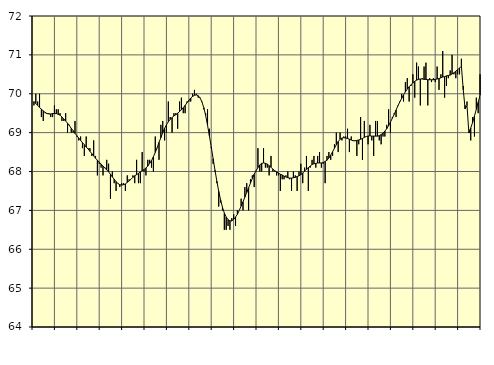
| Category | Piggar | Series 1 |
|---|---|---|
| nan | 69.7 | 69.8 |
| 1.0 | 70 | 69.75 |
| 1.0 | 69.8 | 69.7 |
| 1.0 | 70 | 69.65 |
| 1.0 | 69.4 | 69.6 |
| 1.0 | 69.3 | 69.56 |
| 1.0 | 69.5 | 69.52 |
| 1.0 | 69.5 | 69.49 |
| 1.0 | 69.5 | 69.48 |
| 1.0 | 69.4 | 69.48 |
| 1.0 | 69.4 | 69.49 |
| 1.0 | 69.7 | 69.49 |
| nan | 69.6 | 69.49 |
| 2.0 | 69.6 | 69.47 |
| 2.0 | 69.5 | 69.45 |
| 2.0 | 69.3 | 69.4 |
| 2.0 | 69.3 | 69.35 |
| 2.0 | 69.5 | 69.3 |
| 2.0 | 69 | 69.24 |
| 2.0 | 69.2 | 69.18 |
| 2.0 | 69 | 69.11 |
| 2.0 | 69 | 69.05 |
| 2.0 | 69.3 | 68.98 |
| 2.0 | 68.9 | 68.92 |
| nan | 68.8 | 68.86 |
| 3.0 | 68.9 | 68.8 |
| 3.0 | 68.6 | 68.74 |
| 3.0 | 68.4 | 68.69 |
| 3.0 | 68.9 | 68.63 |
| 3.0 | 68.6 | 68.58 |
| 3.0 | 68.6 | 68.52 |
| 3.0 | 68.4 | 68.46 |
| 3.0 | 68.8 | 68.4 |
| 3.0 | 68.4 | 68.34 |
| 3.0 | 67.9 | 68.29 |
| 3.0 | 68.2 | 68.24 |
| nan | 68.1 | 68.19 |
| 4.0 | 67.9 | 68.14 |
| 4.0 | 68.1 | 68.09 |
| 4.0 | 68.3 | 68.04 |
| 4.0 | 68.2 | 67.99 |
| 4.0 | 67.3 | 67.93 |
| 4.0 | 68 | 67.86 |
| 4.0 | 67.7 | 67.8 |
| 4.0 | 67.5 | 67.74 |
| 4.0 | 67.7 | 67.69 |
| 4.0 | 67.6 | 67.66 |
| 4.0 | 67.7 | 67.65 |
| nan | 67.7 | 67.66 |
| 5.0 | 67.5 | 67.68 |
| 5.0 | 67.9 | 67.72 |
| 5.0 | 67.8 | 67.76 |
| 5.0 | 67.8 | 67.8 |
| 5.0 | 67.9 | 67.85 |
| 5.0 | 67.7 | 67.89 |
| 5.0 | 68.3 | 67.92 |
| 5.0 | 67.7 | 67.95 |
| 5.0 | 67.7 | 67.99 |
| 5.0 | 68.5 | 68.02 |
| 5.0 | 68 | 68.05 |
| nan | 67.9 | 68.09 |
| 6.0 | 68.3 | 68.14 |
| 6.0 | 68.3 | 68.21 |
| 6.0 | 68.1 | 68.28 |
| 6.0 | 68 | 68.38 |
| 6.0 | 68.9 | 68.49 |
| 6.0 | 68.6 | 68.61 |
| 6.0 | 68.3 | 68.75 |
| 6.0 | 69.2 | 68.87 |
| 6.0 | 69.3 | 69 |
| 6.0 | 68.8 | 69.11 |
| 6.0 | 69 | 69.2 |
| nan | 69.8 | 69.28 |
| 7.0 | 69.4 | 69.34 |
| 7.0 | 69 | 69.39 |
| 7.0 | 69.5 | 69.43 |
| 7.0 | 69.5 | 69.46 |
| 7.0 | 69.1 | 69.5 |
| 7.0 | 69.8 | 69.54 |
| 7.0 | 69.9 | 69.59 |
| 7.0 | 69.5 | 69.64 |
| 7.0 | 69.5 | 69.7 |
| 7.0 | 69.8 | 69.77 |
| 7.0 | 69.8 | 69.83 |
| nan | 69.8 | 69.89 |
| 8.0 | 70 | 69.93 |
| 8.0 | 70.1 | 69.96 |
| 8.0 | 70 | 69.97 |
| 8.0 | 69.9 | 69.95 |
| 8.0 | 69.9 | 69.89 |
| 8.0 | 69.8 | 69.79 |
| 8.0 | 69.6 | 69.64 |
| 8.0 | 69.5 | 69.44 |
| 8.0 | 69.6 | 69.19 |
| 8.0 | 69.1 | 68.92 |
| 8.0 | 68.6 | 68.63 |
| nan | 68.2 | 68.33 |
| 9.0 | 68 | 68.03 |
| 9.0 | 67.7 | 67.75 |
| 9.0 | 67.1 | 67.49 |
| 9.0 | 67.2 | 67.27 |
| 9.0 | 67 | 67.08 |
| 9.0 | 66.5 | 66.93 |
| 9.0 | 66.5 | 66.83 |
| 9.0 | 66.6 | 66.76 |
| 9.0 | 66.5 | 66.73 |
| 9.0 | 66.8 | 66.73 |
| 9.0 | 66.9 | 66.77 |
| nan | 66.6 | 66.83 |
| 10.0 | 67 | 66.9 |
| 10.0 | 67 | 67 |
| 10.0 | 67.3 | 67.11 |
| 10.0 | 67 | 67.22 |
| 10.0 | 67.6 | 67.34 |
| 10.0 | 67.7 | 67.46 |
| 10.0 | 67 | 67.58 |
| 10.0 | 67.8 | 67.7 |
| 10.0 | 67.9 | 67.82 |
| 10.0 | 67.6 | 67.93 |
| 10.0 | 68 | 68.02 |
| nan | 68.6 | 68.1 |
| 11.0 | 68 | 68.17 |
| 11.0 | 68 | 68.21 |
| 11.0 | 68.6 | 68.22 |
| 11.0 | 68.1 | 68.21 |
| 11.0 | 68.1 | 68.19 |
| 11.0 | 67.9 | 68.15 |
| 11.0 | 68.4 | 68.11 |
| 11.0 | 68 | 68.06 |
| 11.0 | 68 | 68.02 |
| 11.0 | 67.9 | 67.99 |
| 11.0 | 67.9 | 67.96 |
| nan | 67.5 | 67.93 |
| 12.0 | 67.8 | 67.91 |
| 12.0 | 67.8 | 67.88 |
| 12.0 | 67.9 | 67.86 |
| 12.0 | 68 | 67.84 |
| 12.0 | 67.8 | 67.83 |
| 12.0 | 67.5 | 67.83 |
| 12.0 | 68 | 67.84 |
| 12.0 | 67.9 | 67.85 |
| 12.0 | 67.5 | 67.87 |
| 12.0 | 68 | 67.89 |
| 12.0 | 68.2 | 67.92 |
| nan | 67.7 | 67.96 |
| 13.0 | 68.1 | 68.01 |
| 13.0 | 68.4 | 68.06 |
| 13.0 | 67.5 | 68.1 |
| 13.0 | 68.1 | 68.14 |
| 13.0 | 68.3 | 68.18 |
| 13.0 | 68.4 | 68.2 |
| 13.0 | 68.1 | 68.21 |
| 13.0 | 68.4 | 68.22 |
| 13.0 | 68.5 | 68.22 |
| 13.0 | 68.1 | 68.22 |
| 13.0 | 68.2 | 68.23 |
| nan | 67.7 | 68.26 |
| 14.0 | 68.4 | 68.29 |
| 14.0 | 68.5 | 68.35 |
| 14.0 | 68.3 | 68.42 |
| 14.0 | 68.4 | 68.51 |
| 14.0 | 68.7 | 68.6 |
| 14.0 | 69 | 68.69 |
| 14.0 | 68.5 | 68.77 |
| 14.0 | 69 | 68.83 |
| 14.0 | 68.8 | 68.86 |
| 14.0 | 68.9 | 68.87 |
| 14.0 | 68.9 | 68.86 |
| nan | 69.1 | 68.85 |
| 15.0 | 68.5 | 68.83 |
| 15.0 | 68.9 | 68.81 |
| 15.0 | 68.8 | 68.79 |
| 15.0 | 68.8 | 68.79 |
| 15.0 | 68.4 | 68.8 |
| 15.0 | 68.7 | 68.81 |
| 15.0 | 69.4 | 68.83 |
| 15.0 | 68.3 | 68.85 |
| 15.0 | 69.3 | 68.88 |
| 15.0 | 68.9 | 68.9 |
| 15.0 | 68.7 | 68.91 |
| nan | 69.2 | 68.92 |
| 16.0 | 68.8 | 68.91 |
| 16.0 | 68.4 | 68.91 |
| 16.0 | 69.3 | 68.91 |
| 16.0 | 69.3 | 68.91 |
| 16.0 | 68.8 | 68.92 |
| 16.0 | 68.7 | 68.95 |
| 16.0 | 68.9 | 68.99 |
| 16.0 | 68.9 | 69.04 |
| 16.0 | 69.2 | 69.1 |
| 16.0 | 69.6 | 69.18 |
| 16.0 | 69 | 69.27 |
| nan | 69.4 | 69.37 |
| 17.0 | 69.5 | 69.47 |
| 17.0 | 69.4 | 69.58 |
| 17.0 | 69.7 | 69.69 |
| 17.0 | 69.8 | 69.79 |
| 17.0 | 70 | 69.88 |
| 17.0 | 69.8 | 69.97 |
| 17.0 | 70.3 | 70.05 |
| 17.0 | 70.4 | 70.12 |
| 17.0 | 69.8 | 70.18 |
| 17.0 | 70.2 | 70.23 |
| 17.0 | 70.5 | 70.28 |
| nan | 69.9 | 70.32 |
| 18.0 | 70.8 | 70.35 |
| 18.0 | 70.7 | 70.37 |
| 18.0 | 69.7 | 70.38 |
| 18.0 | 70.4 | 70.38 |
| 18.0 | 70.7 | 70.37 |
| 18.0 | 70.8 | 70.37 |
| 18.0 | 69.7 | 70.36 |
| 18.0 | 70.4 | 70.36 |
| 18.0 | 70.3 | 70.36 |
| 18.0 | 70.4 | 70.36 |
| 18.0 | 70.3 | 70.37 |
| nan | 70.7 | 70.38 |
| 19.0 | 70.1 | 70.39 |
| 19.0 | 70.5 | 70.41 |
| 19.0 | 71.1 | 70.43 |
| 19.0 | 69.9 | 70.44 |
| 19.0 | 70.2 | 70.46 |
| 19.0 | 70.4 | 70.47 |
| 19.0 | 70.6 | 70.48 |
| 19.0 | 71 | 70.51 |
| 19.0 | 70.5 | 70.54 |
| 19.0 | 70.4 | 70.58 |
| 19.0 | 70.5 | 70.62 |
| nan | 70.5 | 70.66 |
| 20.0 | 70.9 | 70.71 |
| 20.0 | 70.2 | 70.1 |
| 20.0 | 69.7 | 69.61 |
| 20.0 | 69.8 | 69.7 |
| 20.0 | 69 | 68.99 |
| 20.0 | 68.8 | 69.12 |
| 20.0 | 69.4 | 69.26 |
| 20.0 | 68.9 | 69.43 |
| 20.0 | 69.9 | 69.6 |
| 20.0 | 69.5 | 69.78 |
| 20.0 | 70.5 | 69.96 |